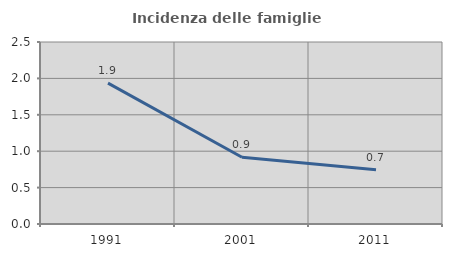
| Category | Incidenza delle famiglie numerose |
|---|---|
| 1991.0 | 1.935 |
| 2001.0 | 0.916 |
| 2011.0 | 0.744 |